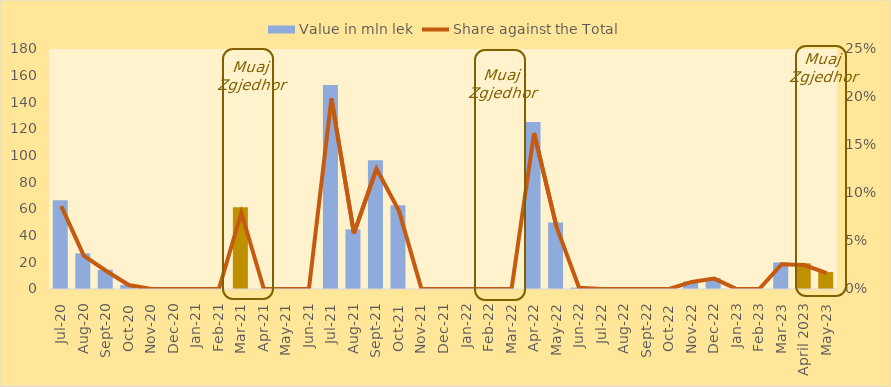
| Category | Value in mln lek |
|---|---|
| Jul-20 | 66.54 |
| Aug-20 | 26.76 |
| Sep-20 | 14.44 |
| Oct-20 | 3.16 |
| Nov-20 | 0 |
| Dec-20 | 0 |
| Jan-21 | 0 |
| Feb-21 | 0 |
| Mar-21 | 61.27 |
| Apr-21 | 0 |
| May-21 | 0 |
| Jun-21 | 0 |
| Jul-21 | 153 |
| Aug-21 | 44.7 |
| Sep-21 | 96.55 |
| Oct-21 | 62.75 |
| Nov-21 | 0 |
| Dec-21 | 0 |
| Jan-22 | 0 |
| Feb-22 | 0 |
| Mar-22 | 0 |
| Apr-22 | 125.25 |
| May-22 | 49.8 |
| Jun-22 | 1 |
| Jul-22 | 0 |
| Aug-22 | 0 |
| Sep-22 | 0 |
| Oct-22 | 0 |
| Nov-22 | 5.678 |
| Dec-22 | 8.362 |
| Jan-23 | 0 |
| Feb-23 | 0 |
| Mar-23 | 19.91 |
| April 2023 | 19.23 |
| May-23 | 12.697 |